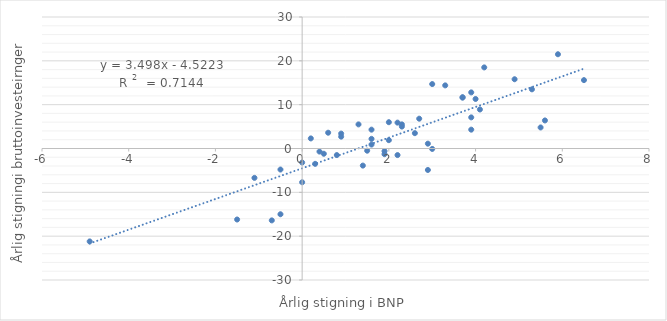
| Category | Series 0 |
|---|---|
| 5.5 | 4.8 |
| 5.6 | 6.4 |
| 6.5 | 15.6 |
| 1.6 | 2.2 |
| 3.0 | -0.1 |
| 3.9 | 7.1 |
| 4.1 | 8.9 |
| -1.1 | -6.7 |
| -1.5 | -16.2 |
| 5.9 | 21.5 |
| 1.9 | -1.3 |
| 2.2 | -1.5 |
| 3.9 | 4.3 |
| -0.5 | -15 |
| -0.7 | -16.4 |
| 3.7 | 11.6 |
| 2.6 | 3.5 |
| 4.2 | 18.5 |
| 4.0 | 11.3 |
| 4.9 | 15.8 |
| 0.3 | -3.5 |
| 0.0 | -3.2 |
| 0.6 | 3.6 |
| 1.5 | -0.5 |
| 1.4 | -3.9 |
| 2.0 | 1.9 |
| 0.0 | -7.7 |
| 5.3 | 13.5 |
| 3.0 | 14.7 |
| 2.9 | 1.1 |
| 3.3 | 14.4 |
| 2.2 | 5.9 |
| 2.9 | -4.9 |
| 3.7 | 11.7 |
| 0.8 | -1.5 |
| 0.5 | -1.2 |
| 0.4 | -0.7 |
| 2.7 | 6.8 |
| 2.3 | 5.5 |
| 3.9 | 12.8 |
| 0.9 | 2.7 |
| -0.5 | -4.8 |
| -4.9 | -21.2 |
| 1.9 | -0.6 |
| 1.3 | 5.5 |
| 0.2 | 2.3 |
| 0.9 | 3.4 |
| 1.6 | 4.3 |
| 1.6 | 0.9 |
| 2.0 | 6 |
| 2.3 | 5 |